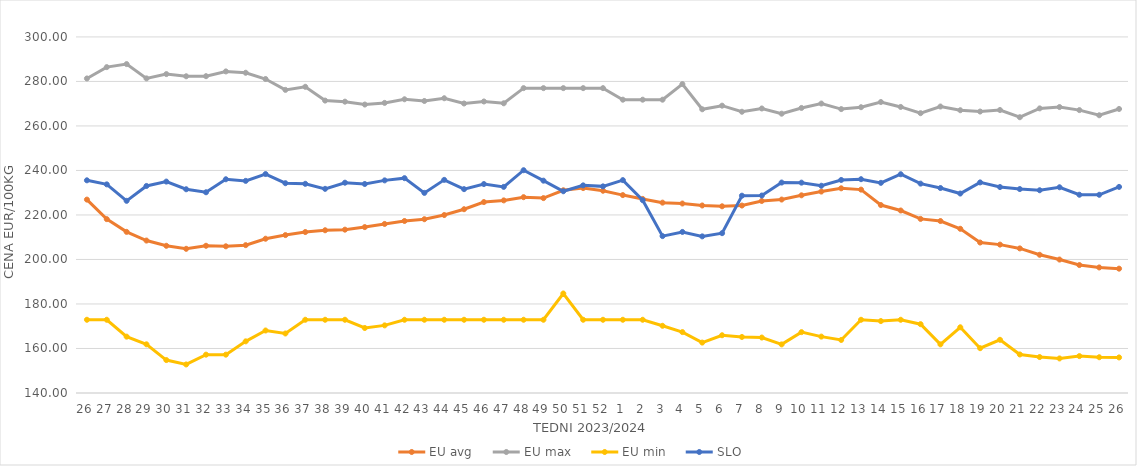
| Category | EU avg | EU max | EU min | SLO |
|---|---|---|---|---|
| 26.0 | 226.903 | 281.34 | 172.91 | 235.57 |
| 27.0 | 218.126 | 286.43 | 172.91 | 233.75 |
| 28.0 | 212.406 | 287.8 | 165.32 | 226.35 |
| 29.0 | 208.504 | 281.37 | 161.87 | 233.03 |
| 30.0 | 206.149 | 283.3 | 154.8 | 235 |
| 31.0 | 204.79 | 282.32 | 152.83 | 231.55 |
| 32.0 | 206.16 | 282.36 | 157.23 | 230.2 |
| 33.0 | 205.917 | 284.5 | 157.23 | 236.04 |
| 34.0 | 206.436 | 283.9 | 163.21 | 235.32 |
| 35.0 | 209.326 | 281.09 | 168.085 | 238.39 |
| 36.0 | 210.957 | 276.21 | 166.745 | 234.27 |
| 37.0 | 212.325 | 277.59 | 172.91 | 234 |
| 38.0 | 213.132 | 271.4 | 172.91 | 231.74 |
| 39.0 | 213.398 | 270.91 | 172.91 | 234.5 |
| 40.0 | 214.548 | 269.62 | 169.209 | 233.92 |
| 41.0 | 215.966 | 270.36 | 170.387 | 235.54 |
| 42.0 | 217.294 | 271.99 | 172.91 | 236.54 |
| 43.0 | 218.091 | 271.22 | 172.91 | 229.92 |
| 44.0 | 219.965 | 272.45 | 172.91 | 235.77 |
| 45.0 | 222.584 | 270.09 | 172.91 | 231.6 |
| 46.0 | 225.795 | 270.99 | 172.91 | 233.89 |
| 47.0 | 226.547 | 270.18 | 172.91 | 232.62 |
| 48.0 | 227.993 | 276.99 | 172.91 | 240.11 |
| 49.0 | 227.575 | 276.99 | 172.91 | 235.41 |
| 50.0 | 231.099 | 276.99 | 184.72 | 230.65 |
| 51.0 | 232.088 | 276.99 | 172.91 | 233.3 |
| 52.0 | 230.884 | 276.99 | 172.91 | 232.85 |
| 1.0 | 228.928 | 271.8 | 172.91 | 235.66 |
| 2.0 | 227.213 | 271.8 | 172.91 | 226.65 |
| 3.0 | 225.533 | 271.8 | 170.2 | 210.5 |
| 4.0 | 225.142 | 278.81 | 167.37 | 212.37 |
| 5.0 | 224.262 | 267.49 | 162.66 | 210.38 |
| 6.0 | 223.902 | 269.11 | 165.95 | 211.82 |
| 7.0 | 224.231 | 266.38 | 165.18 | 228.66 |
| 8.0 | 226.285 | 267.85 | 164.92 | 228.73 |
| 9.0 | 226.925 | 265.51 | 161.84 | 234.57 |
| 10.0 | 228.833 | 268.09 | 167.35 | 234.52 |
| 11.0 | 230.511 | 270.07 | 165.34 | 233.13 |
| 12.0 | 231.98 | 267.57 | 163.83 | 235.73 |
| 13.0 | 231.388 | 268.42 | 172.91 | 236.07 |
| 14.0 | 224.453 | 270.75 | 172.32 | 234.43 |
| 15.0 | 222.007 | 268.54 | 172.91 | 238.3 |
| 16.0 | 218.232 | 265.74 | 170.93 | 234.08 |
| 17.0 | 217.278 | 268.73 | 161.86 | 232.11 |
| 18.0 | 213.787 | 267.06 | 169.53 | 229.63 |
| 19.0 | 207.614 | 266.47 | 160.134 | 234.63 |
| 20.0 | 206.677 | 267.16 | 163.91 | 232.54 |
| 21.0 | 204.973 | 263.92 | 157.32 | 231.64 |
| 22.0 | 202.109 | 267.89 | 156.156 | 231.11 |
| 23.0 | 199.965 | 268.49 | 155.527 | 232.45 |
| 24.0 | 197.492 | 267.12 | 156.58 | 229.09 |
| 25.0 | 196.414 | 264.804 | 156.068 | 229.07 |
| 26.0 | 195.874 | 267.63 | 155.982 | 232.61 |